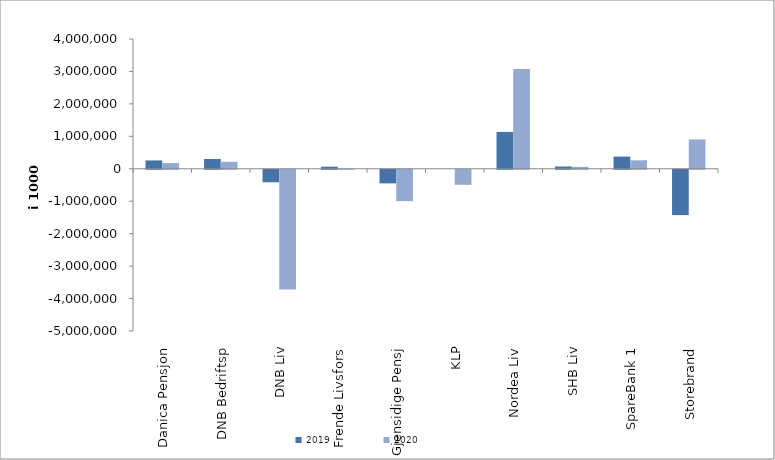
| Category | 2019 | 2020 |
|---|---|---|
| Danica Pensjon | 257596.996 | 174979.345 |
| DNB Bedriftsp | 302024 | 214639 |
| DNB Liv | -385535.373 | -3689736 |
| Frende Livsfors | 64171 | -595 |
| Gjensidige Pensj | -419270 | -966555 |
| KLP | 0 | -462823.85 |
| Nordea Liv | 1135836.201 | 3079048.532 |
| SHB Liv | 70450.499 | 59352.447 |
| SpareBank 1 | 375750.191 | 261540.912 |
| Storebrand | -1397198.817 | 904021.57 |